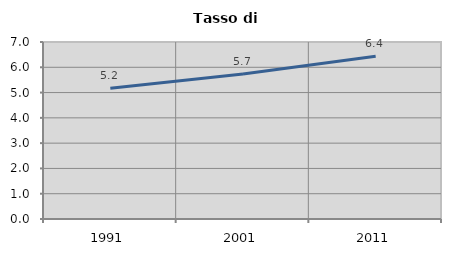
| Category | Tasso di disoccupazione   |
|---|---|
| 1991.0 | 5.172 |
| 2001.0 | 5.738 |
| 2011.0 | 6.433 |